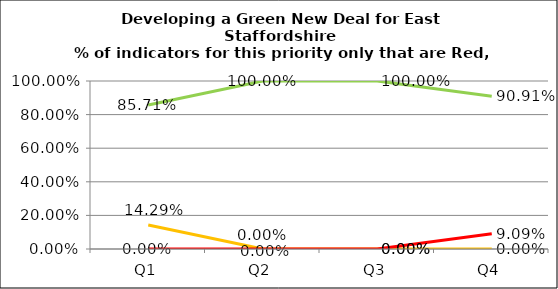
| Category | Green | Amber | Red |
|---|---|---|---|
| Q1 | 0.857 | 0.143 | 0 |
| Q2 | 1 | 0 | 0 |
| Q3 | 1 | 0 | 0 |
| Q4 | 0.909 | 0 | 0.091 |